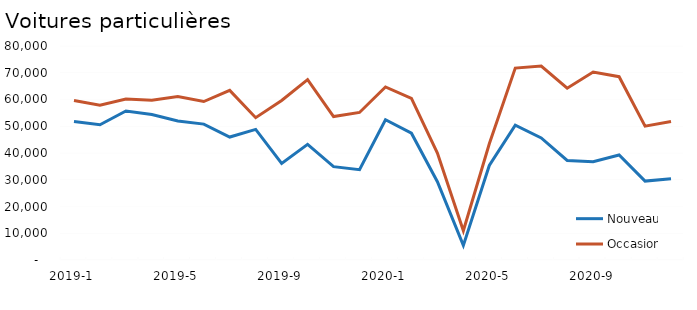
| Category | Nouveau | Occasion |
|---|---|---|
| 2019-1 | 51763 | 59607 |
| 2019-2 | 50575 | 57874 |
| 2019-3 | 55711 | 60185 |
| 2019-4 | 54390 | 59698 |
| 2019-5 | 51972 | 61101 |
| 2019-6 | 50808 | 59250 |
| 2019-7 | 45958 | 63399 |
| 2019-8 | 48837 | 53204 |
| 2019-9 | 36087 | 59630 |
| 2019-10 | 43224 | 67434 |
| 2019-11 | 34896 | 53612 |
| 2019-12 | 33749 | 55154 |
| 2020-1 | 52422 | 64688 |
| 2020-2 | 47413 | 60388 |
| 2020-3 | 29283 | 39963 |
| 2020-4 | 5450 | 10936 |
| 2020-5 | 35328 | 43436 |
| 2020-6 | 50383 | 71734 |
| 2020-7 | 45625 | 72486 |
| 2020-8 | 37231 | 64226 |
| 2020-9 | 36732 | 70258 |
| 2020-10 | 39268 | 68527 |
| 2020-11 | 29500 | 50043 |
| 2020-12 | 30403 | 51780 |